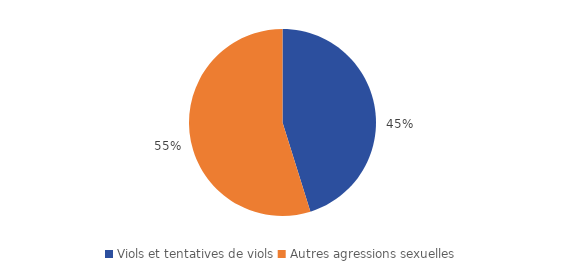
| Category | Series 0 |
|---|---|
| Viols et tentatives de viols | 24800 |
| Autres agressions sexuelles | 30100 |